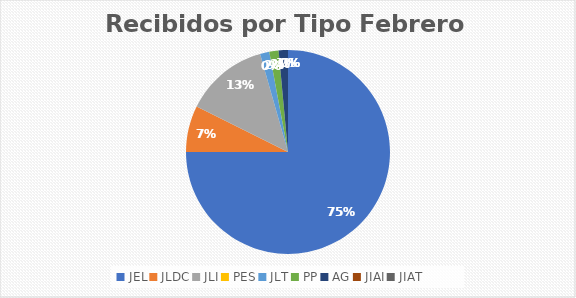
| Category | Series 0 |
|---|---|
| JEL | 51 |
| JLDC | 5 |
| JLI | 9 |
| PES | 0 |
| JLT | 1 |
| PP | 1 |
| AG | 1 |
| JIAI | 0 |
| JIAT | 0 |